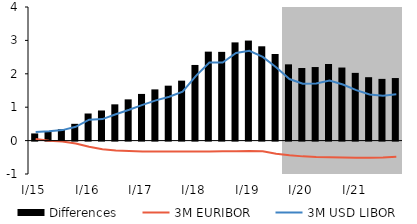
| Category | Differences |
|---|---|
| I/15 | 0.215 |
| II | 0.286 |
| III | 0.342 |
| IV | 0.502 |
| I/16 | 0.811 |
| II | 0.902 |
| III | 1.086 |
| IV | 1.235 |
| I/17 | 1.397 |
| II | 1.533 |
| III | 1.645 |
| IV | 1.795 |
| I/18 | 2.265 |
| II | 2.663 |
| III | 2.657 |
| IV | 2.941 |
| I/19 | 2.995 |
| II | 2.824 |
| III | 2.593 |
| IV | 2.283 |
| I/20 | 2.173 |
| II | 2.202 |
| III | 2.294 |
| IV | 2.187 |
| I/21 | 2.028 |
| II | 1.898 |
| III | 1.848 |
| IV | 1.873 |